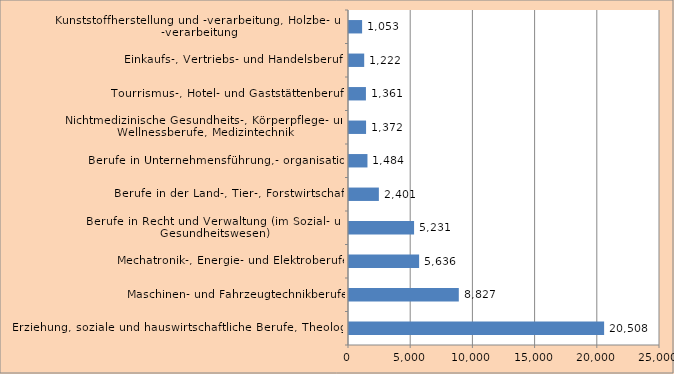
| Category | Series 0 |
|---|---|
| Erziehung, soziale und hauswirtschaftliche Berufe, Theologie | 20508 |
| Maschinen- und Fahrzeugtechnikberufe | 8827 |
| Mechatronik-, Energie- und Elektroberufe | 5636 |
| Berufe in Recht und Verwaltung (im Sozial- und Gesundheitswesen) | 5231 |
| Berufe in der Land-, Tier-, Forstwirtschaft  | 2401 |
| Berufe in Unternehmensführung,- organisation | 1484 |
| Nichtmedizinische Gesundheits-, Körperpflege- und Wellnessberufe, Medizintechnik | 1372 |
| Tourrismus-, Hotel- und Gaststättenberufe | 1361 |
| Einkaufs-, Vertriebs- und Handelsberufe | 1222 |
| Kunststoffherstellung und -verarbeitung, Holzbe- und -verarbeitung | 1053 |